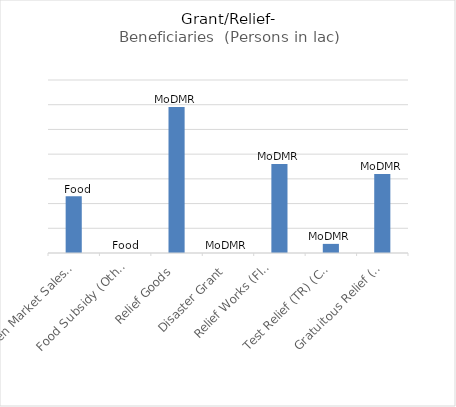
| Category | Beneficiaries  (Persons in lac) |
|---|---|
| Open Market Sales (OMS) | 23 |
| Food Subsidy (Others) | 0 |
| Relief Goods | 59.1 |
| Disaster Grant | 0 |
| Relief Works (Flood, Drought,
Cyclone and Others) | 36 |
| Test Relief (TR) (Cash) | 3.69 |
| Gratuitous Relief (Food) | 32 |